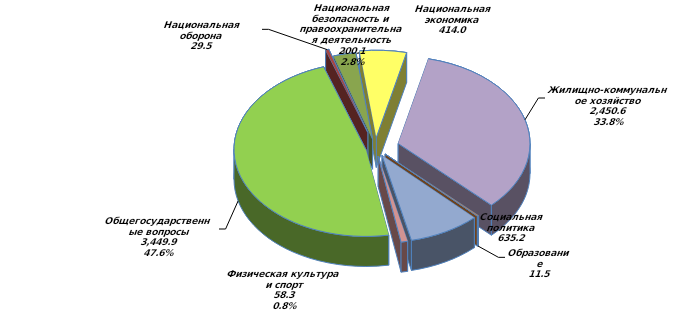
| Category | Series 0 | Series 1 |
|---|---|---|
| Общегосударственные вопросы | 3449.9 | 0.476 |
| Национальная оборона | 29.5 | 0.004 |
| Национальная безопасность и правоохранительная деятельность | 200.1 | 0.028 |
| Национальная экономика | 414 | 0.057 |
| Жилищно-коммунальное хозяйство | 2450.6 | 0.338 |
| Образование | 11.5 | 0.002 |
| Социальная политика | 635.2 | 0.088 |
| Физическая культура и спорт | 58.3 | 0.008 |